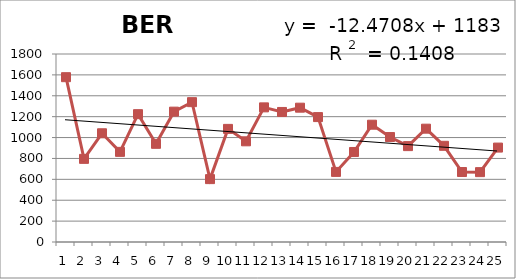
| Category | 1988-2012 |
|---|---|
| 0 | 1578 |
| 1 | 796 |
| 2 | 1041 |
| 3 | 863 |
| 4 | 1224 |
| 5 | 940 |
| 6 | 1248 |
| 7 | 1339 |
| 8 | 602 |
| 9 | 1083 |
| 10 | 964 |
| 11 | 1289 |
| 12 | 1245 |
| 13 | 1286 |
| 14 | 1196 |
| 15 | 671 |
| 16 | 862 |
| 17 | 1123 |
| 18 | 1005 |
| 19 | 918 |
| 20 | 1085 |
| 21 | 921 |
| 22 | 670 |
| 23 | 669 |
| 24 | 904 |